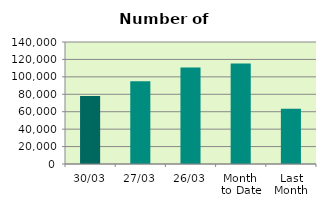
| Category | Series 0 |
|---|---|
| 30/03 | 77932 |
| 27/03 | 94874 |
| 26/03 | 110704 |
| Month 
to Date | 115461.143 |
| Last
Month | 63353.4 |